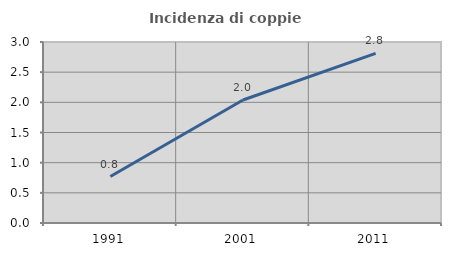
| Category | Incidenza di coppie miste |
|---|---|
| 1991.0 | 0.77 |
| 2001.0 | 2.038 |
| 2011.0 | 2.811 |